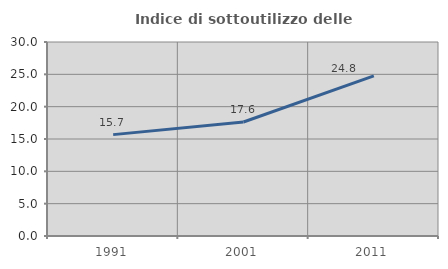
| Category | Indice di sottoutilizzo delle abitazioni  |
|---|---|
| 1991.0 | 15.676 |
| 2001.0 | 17.631 |
| 2011.0 | 24.752 |